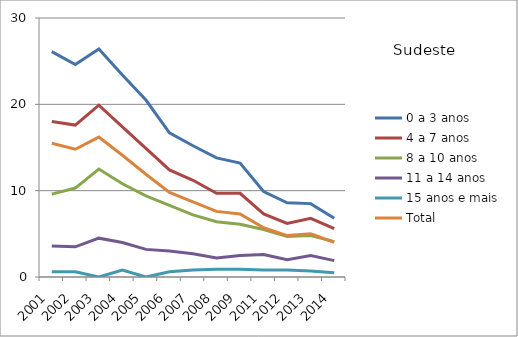
| Category | 0 a 3 anos | 4 a 7 anos | 8 a 10 anos | 11 a 14 anos | 15 anos e mais | Total |
|---|---|---|---|---|---|---|
| 2001.0 | 26.1 | 18 | 9.6 | 3.6 | 0.6 | 15.5 |
| 2002.0 | 24.6 | 17.6 | 10.3 | 3.5 | 0.6 | 14.8 |
| 2003.0 | 26.4 | 19.9 | 12.5 | 4.5 | 0 | 16.2 |
| 2004.0 | 23.4 | 17.4 | 10.8 | 4 | 0.8 | 14.1 |
| 2005.0 | 20.5 | 14.9 | 9.4 | 3.2 | 0 | 11.9 |
| 2006.0 | 16.7 | 12.4 | 8.3 | 3 | 0.6 | 9.8 |
| 2007.0 | 15.2 | 11.2 | 7.2 | 2.7 | 0.8 | 8.7 |
| 2008.0 | 13.8 | 9.7 | 6.4 | 2.2 | 0.9 | 7.6 |
| 2009.0 | 13.2 | 9.7 | 6.1 | 2.5 | 0.9 | 7.3 |
| 2011.0 | 9.9 | 7.3 | 5.5 | 2.6 | 0.8 | 5.7 |
| 2012.0 | 8.6 | 6.2 | 4.7 | 2 | 0.8 | 4.8 |
| 2013.0 | 8.5 | 6.8 | 4.8 | 2.5 | 0.7 | 5 |
| 2014.0 | 6.8 | 5.6 | 4.1 | 1.9 | 0.5 | 4 |